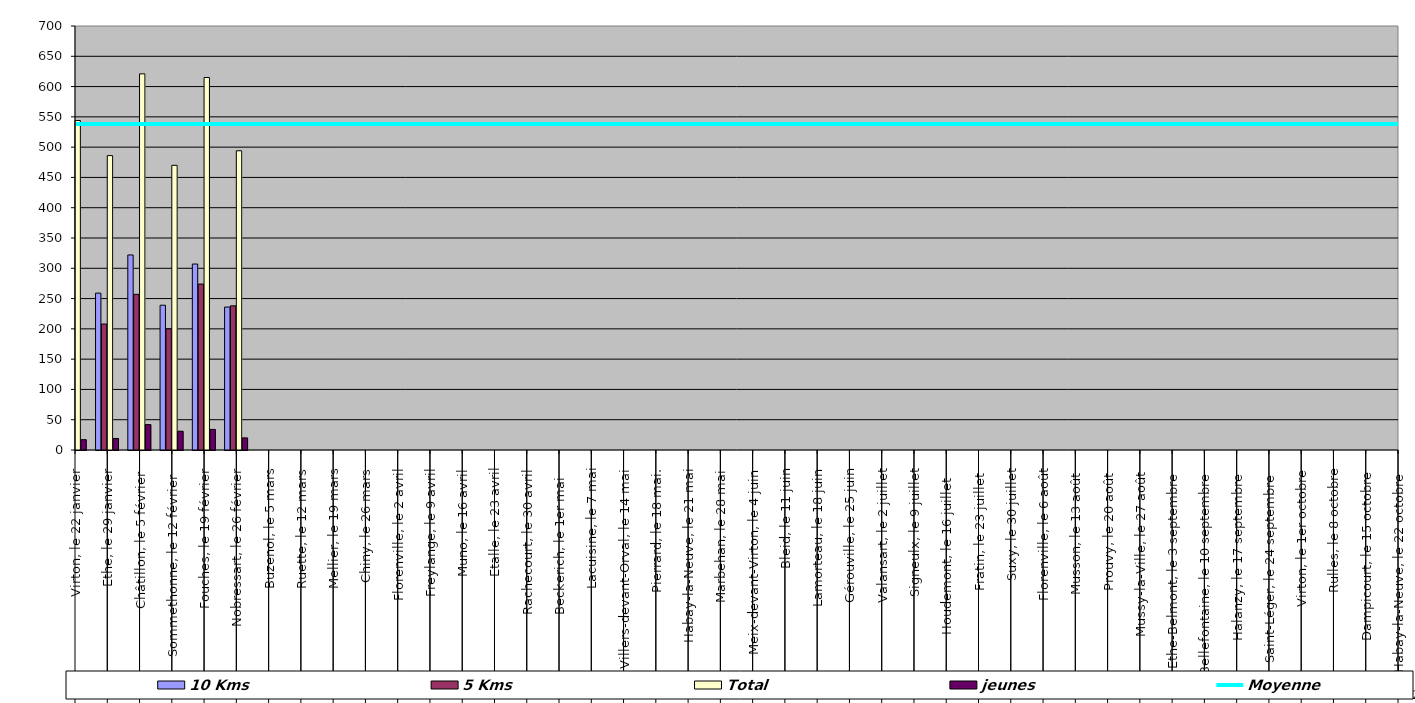
| Category | 10 Kms | 5 Kms | Total | jeunes |
|---|---|---|---|---|
| 0 | 296 | 231 | 544 | 17 |
| 1 | 259 | 208 | 486 | 19 |
| 2 | 322 | 257 | 621 | 42 |
| 3 | 239 | 200 | 470 | 31 |
| 4 | 307 | 274 | 615 | 34 |
| 5 | 236 | 238 | 494 | 20 |
| 6 | 0 | 0 | 0 | 0 |
| 7 | 0 | 0 | 0 | 0 |
| 8 | 0 | 0 | 0 | 0 |
| 9 | 0 | 0 | 0 | 0 |
| 10 | 0 | 0 | 0 | 0 |
| 11 | 0 | 0 | 0 | 0 |
| 12 | 0 | 0 | 0 | 0 |
| 13 | 0 | 0 | 0 | 0 |
| 14 | 0 | 0 | 0 | 0 |
| 15 | 0 | 0 | 0 | 0 |
| 16 | 0 | 0 | 0 | 0 |
| 17 | 0 | 0 | 0 | 0 |
| 18 | 0 | 0 | 0 | 0 |
| 19 | 0 | 0 | 0 | 0 |
| 20 | 0 | 0 | 0 | 0 |
| 21 | 0 | 0 | 0 | 0 |
| 22 | 0 | 0 | 0 | 0 |
| 23 | 0 | 0 | 0 | 0 |
| 24 | 0 | 0 | 0 | 0 |
| 25 | 0 | 0 | 0 | 0 |
| 26 | 0 | 0 | 0 | 0 |
| 27 | 0 | 0 | 0 | 0 |
| 28 | 0 | 0 | 0 | 0 |
| 29 | 0 | 0 | 0 | 0 |
| 30 | 0 | 0 | 0 | 0 |
| 31 | 0 | 0 | 0 | 0 |
| 32 | 0 | 0 | 0 | 0 |
| 33 | 0 | 0 | 0 | 0 |
| 34 | 0 | 0 | 0 | 0 |
| 35 | 0 | 0 | 0 | 0 |
| 36 | 0 | 0 | 0 | 0 |
| 37 | 0 | 0 | 0 | 0 |
| 38 | 0 | 0 | 0 | 0 |
| 39 | 0 | 0 | 0 | 0 |
| 40 | 0 | 0 | 0 | 0 |
| 41 | 0 | 0 | 0 | 0 |